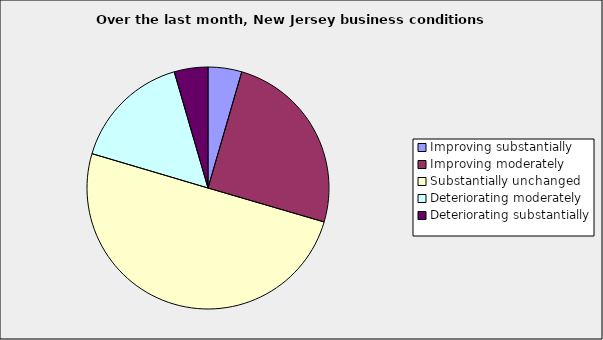
| Category | Series 0 |
|---|---|
| Improving substantially | 0.045 |
| Improving moderately | 0.25 |
| Substantially unchanged | 0.5 |
| Deteriorating moderately | 0.159 |
| Deteriorating substantially | 0.045 |